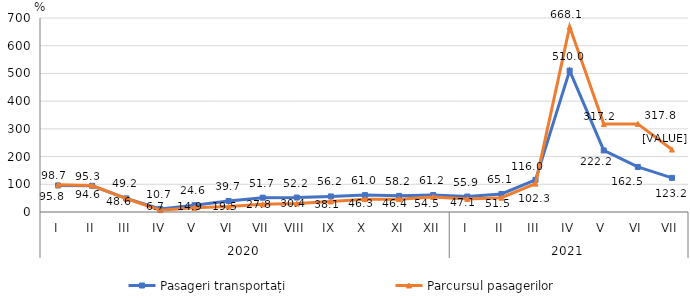
| Category | Pasageri transportați | Parcursul pasagerilor |
|---|---|---|
| 0 | 95.8 | 98.7 |
| 1 | 94.6 | 95.3 |
| 2 | 49.2 | 48.6 |
| 3 | 10.7 | 6.7 |
| 4 | 24.6 | 14.9 |
| 5 | 39.7 | 19.5 |
| 6 | 51.7 | 27.8 |
| 7 | 52.2 | 30.4 |
| 8 | 56.2 | 38.1 |
| 9 | 61 | 46.3 |
| 10 | 58.2 | 46.4 |
| 11 | 61.2 | 54.5 |
| 12 | 55.9 | 47.1 |
| 13 | 65.1 | 51.5 |
| 14 | 116 | 102.3 |
| 15 | 510 | 668.1 |
| 16 | 222.2 | 317.2 |
| 17 | 162.5 | 317.8 |
| 18 | 123.2 | 225.4 |